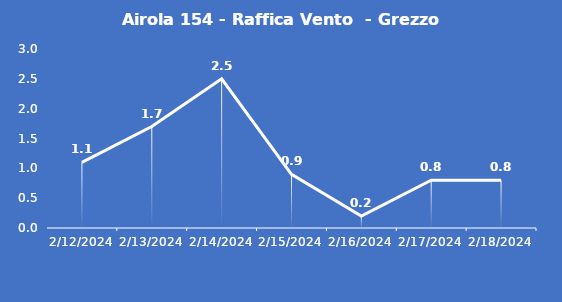
| Category | Airola 154 - Raffica Vento  - Grezzo (m/s) |
|---|---|
| 2/12/24 | 1.1 |
| 2/13/24 | 1.7 |
| 2/14/24 | 2.5 |
| 2/15/24 | 0.9 |
| 2/16/24 | 0.2 |
| 2/17/24 | 0.8 |
| 2/18/24 | 0.8 |